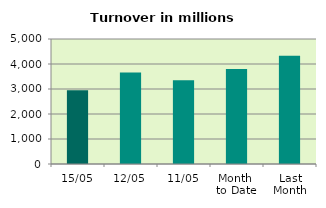
| Category | Series 0 |
|---|---|
| 15/05 | 2954.358 |
| 12/05 | 3664.169 |
| 11/05 | 3349.012 |
| Month 
to Date | 3798.377 |
| Last
Month | 4332.281 |